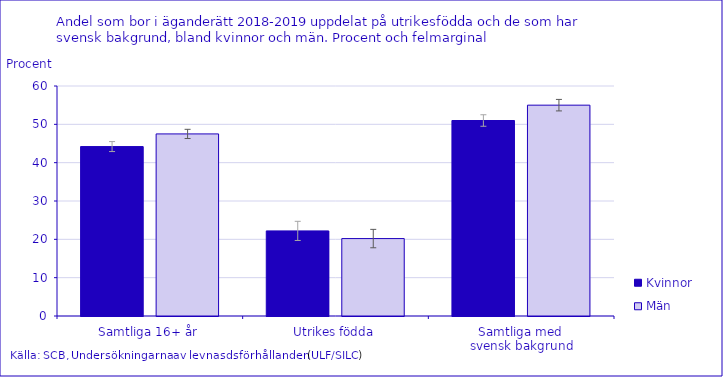
| Category | Kvinnor | Män |
|---|---|---|
| Samtliga 16+ år | 44.2 | 47.5 |
| Utrikes födda | 22.2 | 20.2 |
| Samtliga med 
svensk bakgrund | 51 | 55 |